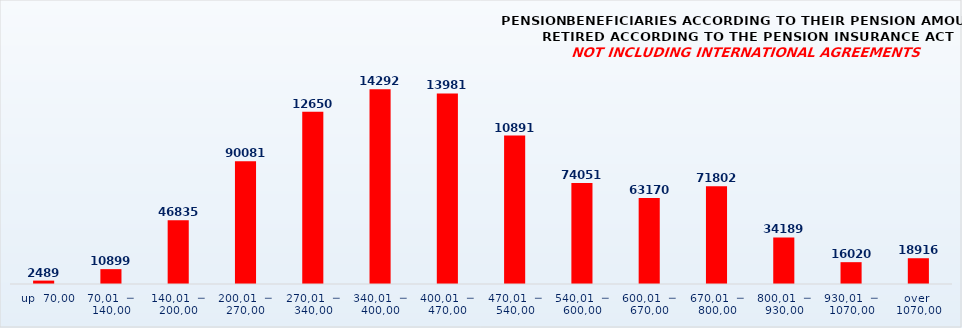
| Category | PENSION BENEFICIARIES ACCORDING TO TYPES AND AMOUNTS OF PENSION, RETIRED ACCORDING TO THE PENSION INSURANCE ACT
NOT INCLUDING INTERNATIONAL AGREEMENTS |
|---|---|
|   up  70,00 | 2489 |
| 70,01  ─  140,00 | 10899 |
| 140,01  ─  200,00 | 46835 |
| 200,01  ─  270,00 | 90081 |
| 270,01  ─  340,00 | 126500 |
| 340,01  ─  400,00 | 142926 |
| 400,01  ─  470,00 | 139818 |
| 470,01  ─  540,00 | 108919 |
| 540,01  ─  600,00 | 74051 |
| 600,01  ─  670,00 | 63170 |
| 670,01  ─  800,00 | 71802 |
| 800,01  ─  930,00 | 34189 |
| 930,01  ─  1070,00 | 16020 |
| over  1070,00 | 18916 |